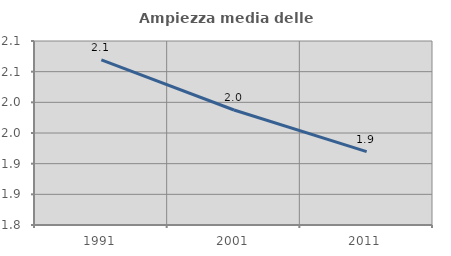
| Category | Ampiezza media delle famiglie |
|---|---|
| 1991.0 | 2.069 |
| 2001.0 | 1.988 |
| 2011.0 | 1.92 |